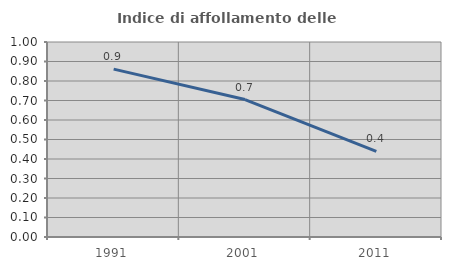
| Category | Indice di affollamento delle abitazioni  |
|---|---|
| 1991.0 | 0.861 |
| 2001.0 | 0.705 |
| 2011.0 | 0.439 |